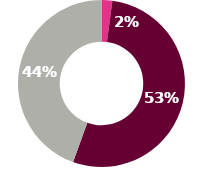
| Category | Series 0 |
|---|---|
| 0 | 2.6 |
| 1 | 66.7 |
| 2 | 55.5 |